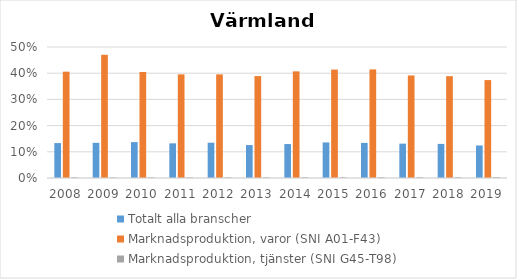
| Category | Totalt alla branscher | Marknadsproduktion, varor (SNI A01-F43) | Marknadsproduktion, tjänster (SNI G45-T98) |
|---|---|---|---|
| 2008 | 0.133 | 0.406 | 0.003 |
| 2009 | 0.134 | 0.47 | 0.002 |
| 2010 | 0.137 | 0.405 | 0.003 |
| 2011 | 0.132 | 0.396 | 0.003 |
| 2012 | 0.135 | 0.395 | 0.003 |
| 2013 | 0.126 | 0.389 | 0.003 |
| 2014 | 0.13 | 0.407 | 0.003 |
| 2015 | 0.136 | 0.414 | 0.003 |
| 2016 | 0.134 | 0.414 | 0.003 |
| 2017 | 0.131 | 0.391 | 0.003 |
| 2018 | 0.13 | 0.389 | 0.003 |
| 2019 | 0.124 | 0.374 | 0.003 |